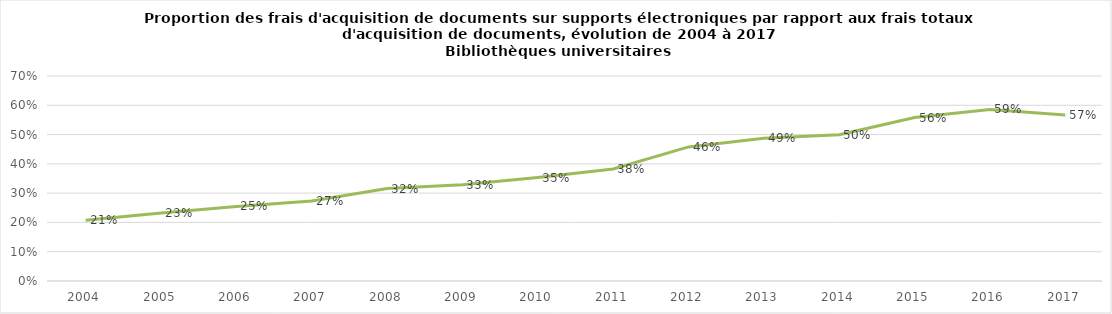
| Category | Proportion des frais d'acquisition de documents 
électroniques par rapport aux frais totaux d'acquisition de documents |
|---|---|
| 2004.0 | 0.208 |
| 2005.0 | 0.232 |
| 2006.0 | 0.255 |
| 2007.0 | 0.273 |
| 2008.0 | 0.316 |
| 2009.0 | 0.329 |
| 2010.0 | 0.353 |
| 2011.0 | 0.382 |
| 2012.0 | 0.458 |
| 2013.0 | 0.488 |
| 2014.0 | 0.499 |
| 2015.0 | 0.558 |
| 2016.0 | 0.586 |
| 2017.0 | 0.567 |